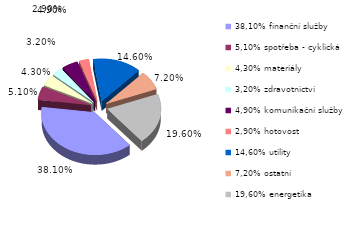
| Category | Series 0 |
|---|---|
| 38,10% finanční služby | 0.381 |
| 5,10% spotřeba - cyklická | 0.051 |
| 4,30% materiály | 0.043 |
| 3,20% zdravotnictví | 0.032 |
| 4,90% komunikační služby | 0.049 |
| 2,90% hotovost | 0.029 |
| 14,60% utility | 0.146 |
| 7,20% ostatní | 0.072 |
| 19,60% energetika | 0.196 |